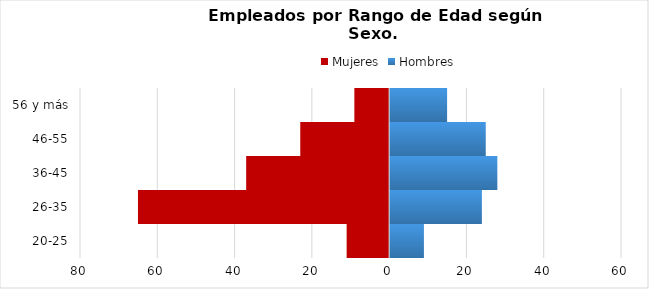
| Category | Mujeres | Hombres |
|---|---|---|
| 20-25 | -11 | 9 |
| 26-35 | -65 | 24 |
| 36-45 | -37 | 28 |
| 46-55 | -23 | 25 |
| 56 y más | -9 | 15 |